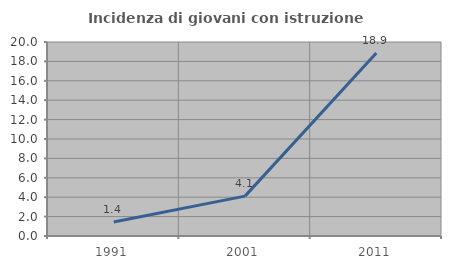
| Category | Incidenza di giovani con istruzione universitaria |
|---|---|
| 1991.0 | 1.449 |
| 2001.0 | 4.11 |
| 2011.0 | 18.868 |